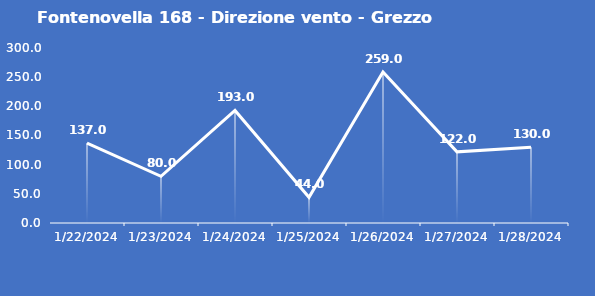
| Category | Fontenovella 168 - Direzione vento - Grezzo (°N) |
|---|---|
| 1/22/24 | 137 |
| 1/23/24 | 80 |
| 1/24/24 | 193 |
| 1/25/24 | 44 |
| 1/26/24 | 259 |
| 1/27/24 | 122 |
| 1/28/24 | 130 |